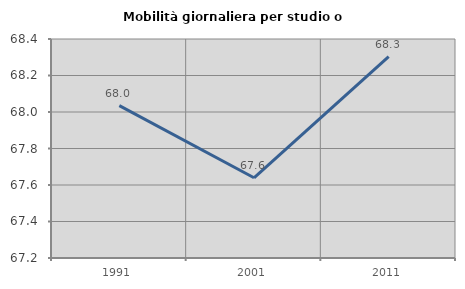
| Category | Mobilità giornaliera per studio o lavoro |
|---|---|
| 1991.0 | 68.035 |
| 2001.0 | 67.639 |
| 2011.0 | 68.303 |